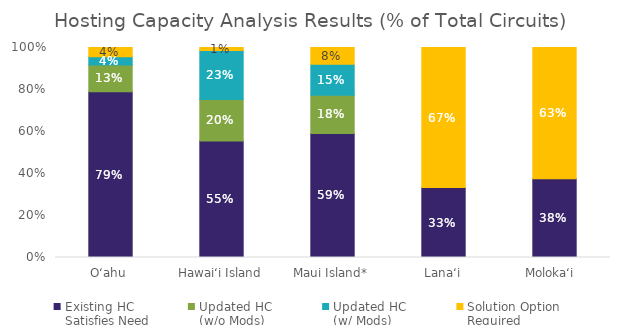
| Category | Existing HC 
Satisfies Need | Updated HC 
(w/o Mods) 
Satisfies Need | Updated HC 
(w/ Mods) 
Satisfies Need | Solution Option 
Required |
|---|---|---|---|---|
| O‘ahu | 0.789 | 0.128 | 0.039 | 0.044 |
| Hawai‘i Island | 0.555 | 0.197 | 0.234 | 0.015 |
| Maui Island* | 0.591 | 0.182 | 0.148 | 0.08 |
| Lana‘i | 0.333 | 0 | 0 | 0.667 |
| Moloka‘i  | 0.375 | 0 | 0 | 0.625 |